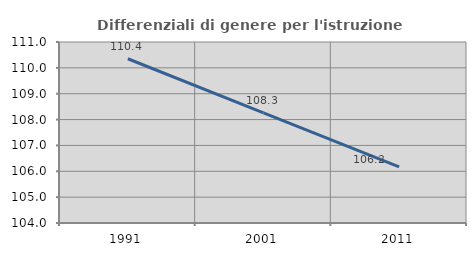
| Category | Differenziali di genere per l'istruzione superiore |
|---|---|
| 1991.0 | 110.352 |
| 2001.0 | 108.256 |
| 2011.0 | 106.17 |